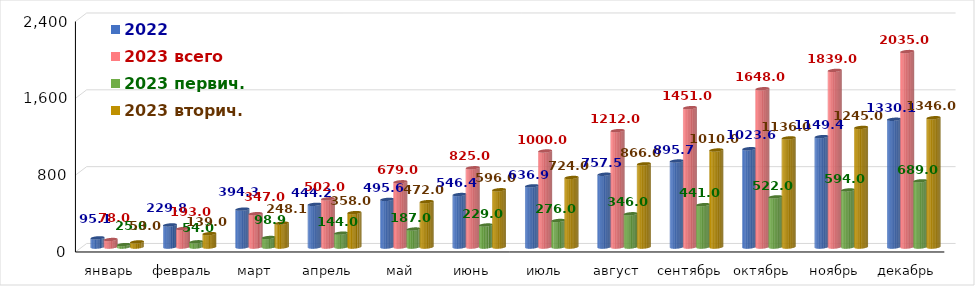
| Category | 2022 | 2023 всего | 2023 первич. | 2023 вторич. |
|---|---|---|---|---|
| январь | 95.122 | 78 | 25 | 53 |
| февраль | 229.762 | 193 | 54 | 139 |
| март | 394.318 | 347 | 98.9 | 248.1 |
| апрель | 444.248 | 502 | 144 | 358 |
| май | 495.62 | 679 | 187 | 472 |
| июнь | 546.358 | 825 | 229 | 596 |
| июль | 636.943 | 1000 | 276 | 724 |
| август | 757.5 | 1212 | 346 | 866 |
| сентябрь | 895.679 | 1451 | 441 | 1010 |
| октябрь | 1023.602 | 1648 | 522 | 1136 |
| ноябрь | 1149.375 | 1839 | 594 | 1245 |
| декабрь | 1330.065 | 2035 | 689 | 1346 |